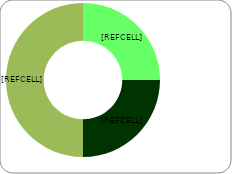
| Category | Series 0 |
|---|---|
| 0 | 0.5 |
| 1 | 0.5 |
| 2 | 1 |